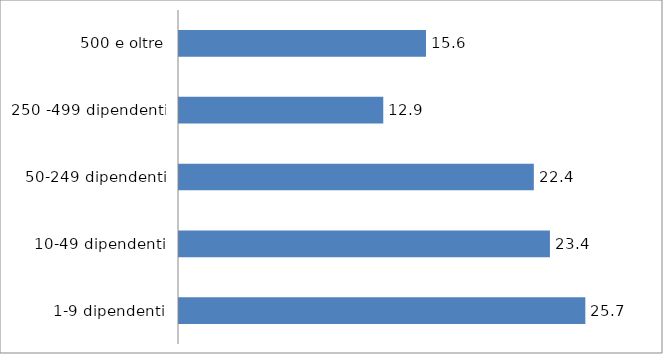
| Category | Series 0 |
|---|---|
| 1-9 dipendenti | 25.663 |
| 10-49 dipendenti | 23.427 |
| 50-249 dipendenti | 22.41 |
| 250 -499 dipendenti | 12.901 |
| 500 e oltre | 15.599 |